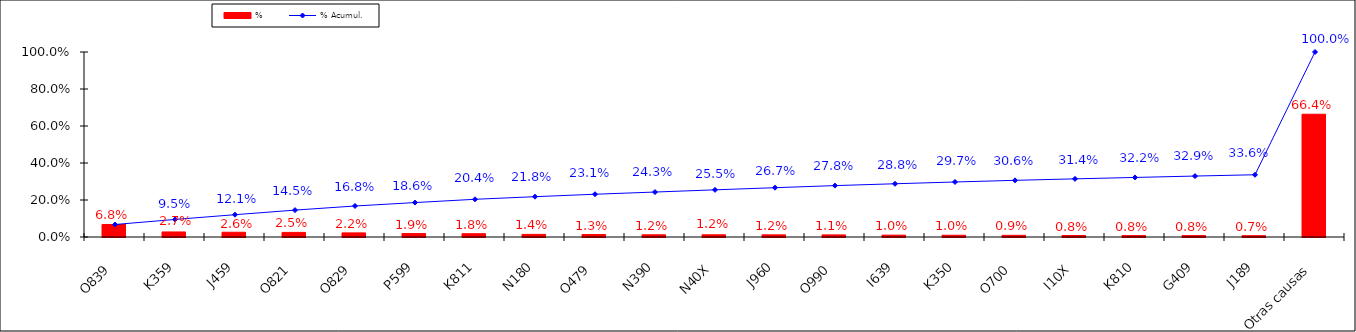
| Category | % |
|---|---|
| O839 | 0.068 |
| K359 | 0.027 |
| J459 | 0.026 |
| O821 | 0.025 |
| O829 | 0.022 |
| P599 | 0.019 |
| K811 | 0.018 |
| N180 | 0.014 |
| O479 | 0.013 |
| N390 | 0.012 |
| N40X | 0.012 |
| J960 | 0.012 |
| O990 | 0.011 |
| I639 | 0.01 |
| K350 | 0.01 |
| O700 | 0.009 |
| I10X | 0.008 |
| K810 | 0.008 |
| G409 | 0.008 |
| J189 | 0.007 |
| Otras causas | 0.664 |